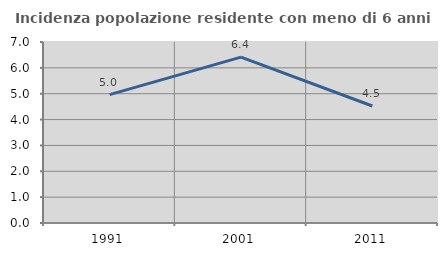
| Category | Incidenza popolazione residente con meno di 6 anni |
|---|---|
| 1991.0 | 4.965 |
| 2001.0 | 6.414 |
| 2011.0 | 4.526 |